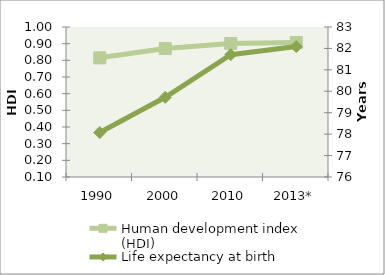
| Category | Human development index (HDI) |
|---|---|
| 1990 | 0.815 |
| 2000 | 0.871 |
| 2010 | 0.901 |
| 2013* | 0.906 |